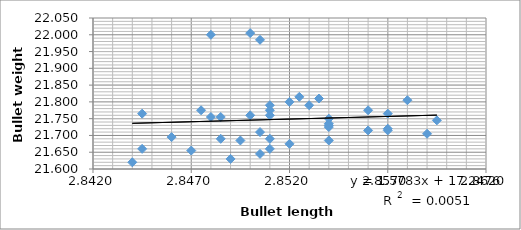
| Category | Wt(g) |
|---|---|
| 2.854 | 21.76 |
| 2.85 | 21.695 |
| 2.853 | 21.79 |
| 2.849 | 21.75 |
| 2.8555 | 21.725 |
| 2.845 | 21.815 |
| 2.8545 | 22.005 |
| 2.858 | 21.685 |
| 2.8525 | 21.755 |
| 2.848 | 21.985 |
| 2.856 | 21.69 |
| 2.8475 | 21.8 |
| 2.851 | 21.745 |
| 2.8455 | 21.72 |
| 2.8555 | 21.655 |
| 2.86 | 21.685 |
| 2.849 | 21.62 |
| 2.848 | 22 |
| 2.8485 | 21.69 |
| 2.8535 | 21.765 |
| 2.851 | 21.715 |
| 2.8535 | 21.79 |
| 2.857 | 21.735 |
| 2.851 | 21.775 |
| 2.854 | 21.715 |
| 2.851 | 21.66 |
| 2.8455 | 21.81 |
| 2.85 | 21.63 |
| 2.8535 | 21.66 |
| 2.8475 | 21.645 |
| 2.8495 | 21.755 |
| 2.846 | 21.73 |
| 2.85 | 21.675 |
| 2.855 | 21.71 |
| 2.8575 | 21.775 |
| 2.848 | 21.765 |
| 2.8475 | 21.775 |
| 2.853 | 21.76 |
| 2.859 | 21.705 |
| 2.847 | 21.805 |